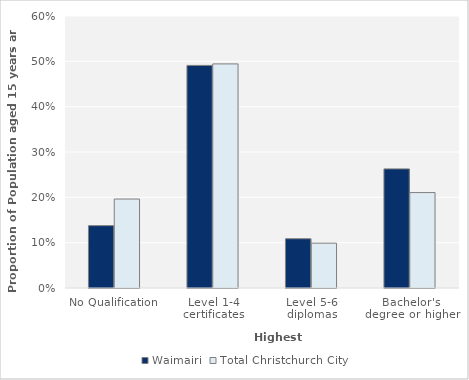
| Category | Waimairi | Total Christchurch City |
|---|---|---|
| No Qualification | 0.138 | 0.196 |
| Level 1-4 certificates | 0.491 | 0.494 |
| Level 5-6 diplomas | 0.109 | 0.099 |
| Bachelor's degree or higher | 0.263 | 0.211 |